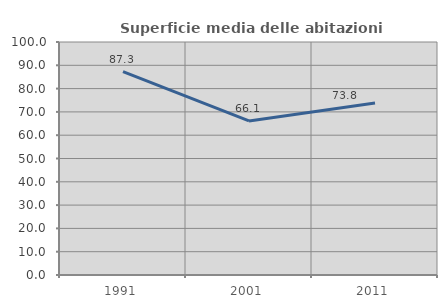
| Category | Superficie media delle abitazioni occupate |
|---|---|
| 1991.0 | 87.276 |
| 2001.0 | 66.131 |
| 2011.0 | 73.775 |